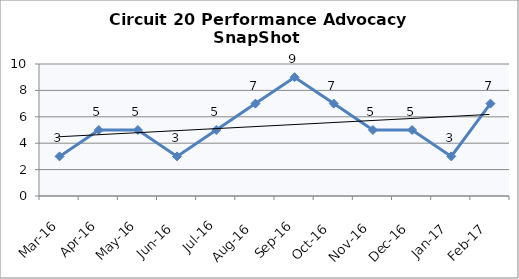
| Category | Circuit 20 |
|---|---|
| Mar-16 | 3 |
| Apr-16 | 5 |
| May-16 | 5 |
| Jun-16 | 3 |
| Jul-16 | 5 |
| Aug-16 | 7 |
| Sep-16 | 9 |
| Oct-16 | 7 |
| Nov-16 | 5 |
| Dec-16 | 5 |
| Jan-17 | 3 |
| Feb-17 | 7 |